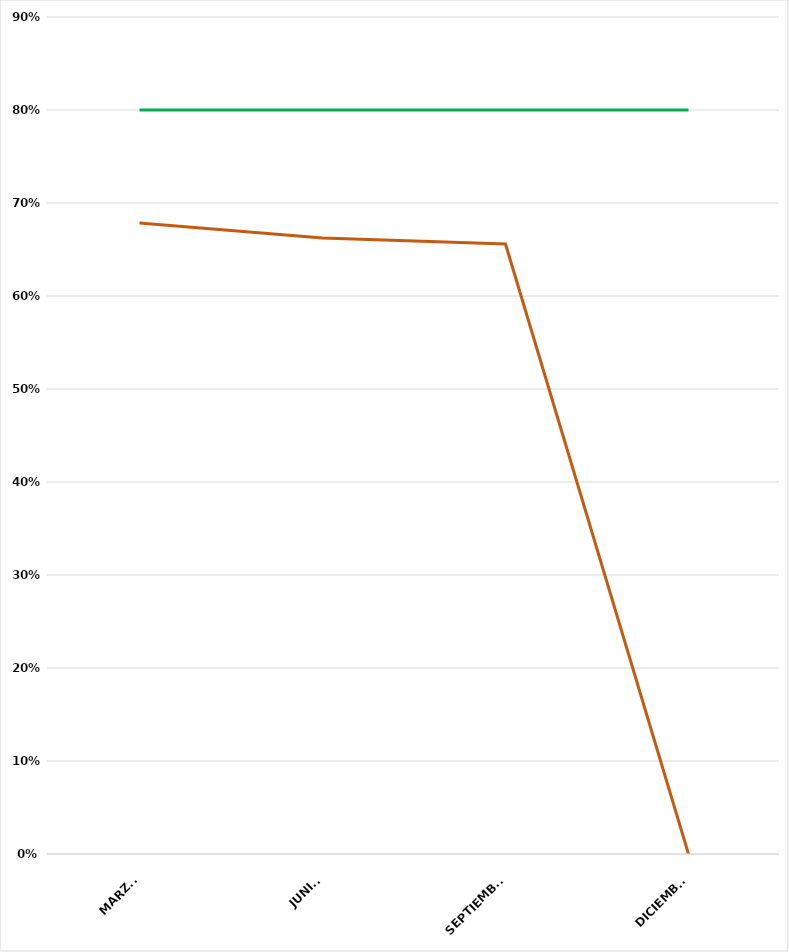
| Category | VALOR  | META PONDERADA |
|---|---|---|
| MARZO | 0.678 | 0.8 |
| JUNIO | 0.662 | 0.8 |
| SEPTIEMBRE | 0.656 | 0.8 |
| DICIEMBRE | 0 | 0.8 |